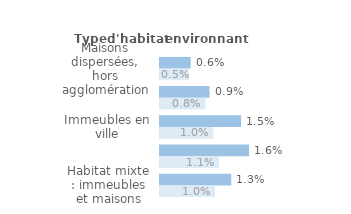
| Category | Series 1 | Series 0 |
|---|---|---|
| Maisons dispersées, hors agglomération | 0.006 | 0.005 |
| Maisons en lotissement, en quartier pavillonnaire | 0.009 | 0.008 |
| Immeubles en ville | 0.015 | 0.01 |
| Immeubles en cité ou grand ensemble | 0.016 | 0.011 |
| Habitat mixte : immeubles et maisons | 0.013 | 0.01 |